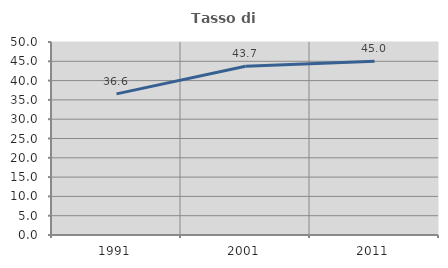
| Category | Tasso di occupazione   |
|---|---|
| 1991.0 | 36.555 |
| 2001.0 | 43.696 |
| 2011.0 | 45.043 |